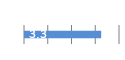
| Category | Series 0 |
|---|---|
| 0 | 3.25 |